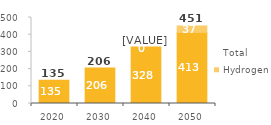
| Category | Final | Hydrogen | Total |
|---|---|---|---|
| 2020.0 | 135.244 | 0 | 135.244 |
| 2030.0 | 205.969 | 0 | 205.969 |
| 2040.0 | 327.948 | 0 | 327.948 |
| 2050.0 | 413.415 | 37.335 | 450.75 |